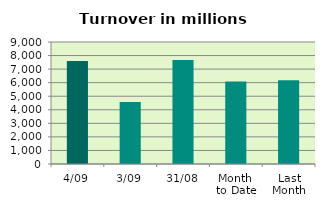
| Category | Series 0 |
|---|---|
| 4/09 | 7607.575 |
| 3/09 | 4575.238 |
| 31/08 | 7663.04 |
| Month 
to Date | 6091.406 |
| Last
Month | 6185.877 |